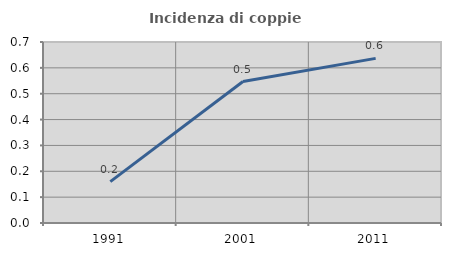
| Category | Incidenza di coppie miste |
|---|---|
| 1991.0 | 0.16 |
| 2001.0 | 0.547 |
| 2011.0 | 0.637 |